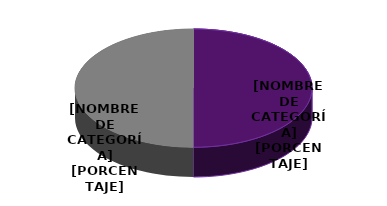
| Category | Series 0 |
|---|---|
| FEMENINO | 3 |
| MASCULINO | 3 |